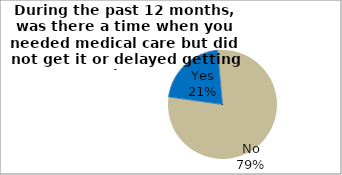
| Category | Series 0 |
|---|---|
| Yes | 21.341 |
| No | 78.659 |